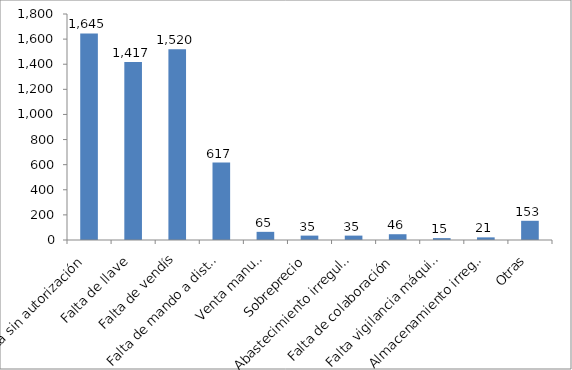
| Category | Expedientes iniciados en 2014 |
|---|---|
| Venta sin autorización | 1645 |
| Falta de llave | 1417 |
| Falta de vendís | 1520 |
| Falta de mando a distancia | 617 |
| Venta manual | 65 |
| Sobreprecio | 35 |
| Abastecimiento irregular | 35 |
| Falta de colaboración | 46 |
| Falta vigilancia máquinas | 15 |
| Almacenamiento irregular | 21 |
| Otras | 153 |